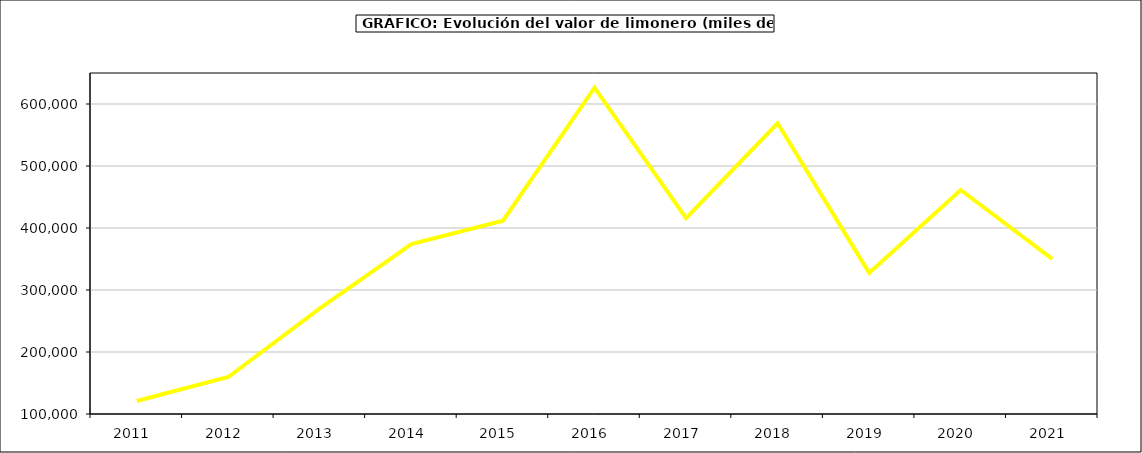
| Category | Valor |
|---|---|
| 2011.0 | 121030.951 |
| 2012.0 | 159689.894 |
| 2013.0 | 270510.614 |
| 2014.0 | 373950.238 |
| 2015.0 | 411737 |
| 2016.0 | 626329 |
| 2017.0 | 415897.996 |
| 2018.0 | 568828.291 |
| 2019.0 | 327602.422 |
| 2020.0 | 461310.053 |
| 2021.0 | 350120.079 |